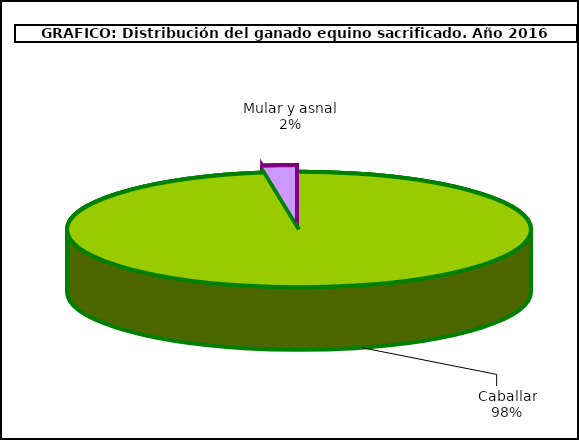
| Category | Series 0 |
|---|---|
| Caballar | 52671 |
| Mular y asnal | 1297 |